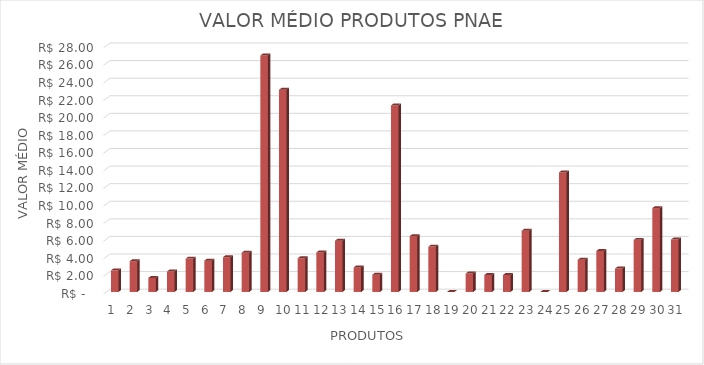
| Category | Series 0 |
|---|---|
| 0 | 2.463 |
| 1 | 3.497 |
| 2 | 1.597 |
| 3 | 2.33 |
| 4 | 3.797 |
| 5 | 3.563 |
| 6 | 3.963 |
| 7 | 4.463 |
| 8 | 26.9 |
| 9 | 23 |
| 10 | 3.833 |
| 11 | 4.497 |
| 12 | 5.83 |
| 13 | 2.797 |
| 14 | 1.967 |
| 15 | 21.22 |
| 16 | 6.35 |
| 17 | 5.163 |
| 18 | 0 |
| 19 | 2.1 |
| 20 | 1.93 |
| 21 | 1.93 |
| 22 | 6.963 |
| 23 | 0 |
| 24 | 13.6 |
| 25 | 3.663 |
| 26 | 4.663 |
| 27 | 2.663 |
| 28 | 5.93 |
| 29 | 9.533 |
| 30 | 5.963 |